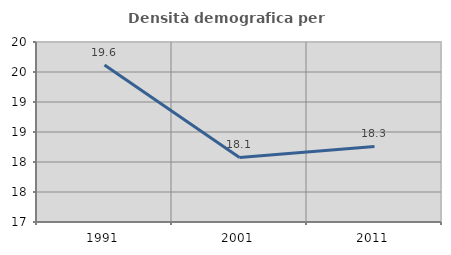
| Category | Densità demografica |
|---|---|
| 1991.0 | 19.616 |
| 2001.0 | 18.076 |
| 2011.0 | 18.26 |